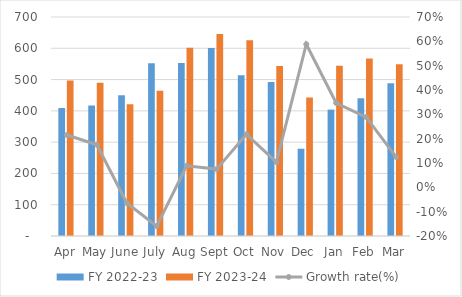
| Category | FY 2022-23 | FY 2023-24 |
|---|---|---|
| Apr | 409 | 497 |
| May | 417 | 490 |
| June | 450 | 421 |
| July | 552 | 464 |
| Aug | 553 | 602 |
| Sept | 601 | 646 |
| Oct | 514 | 626 |
| Nov | 492 | 543 |
| Dec | 278.962 | 443 |
| Jan | 404 | 544 |
| Feb | 440 | 567 |
| Mar | 488 | 549 |